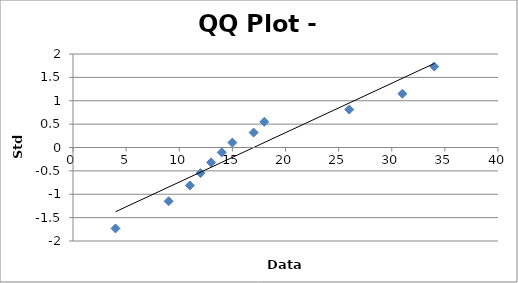
| Category | Series 0 |
|---|---|
| 4.0 | -1.732 |
| 9.0 | -1.15 |
| 11.0 | -0.812 |
| 12.0 | -0.549 |
| 13.0 | -0.319 |
| 14.0 | -0.105 |
| 15.0 | 0.105 |
| 17.0 | 0.319 |
| 18.0 | 0.549 |
| 26.0 | 0.812 |
| 31.0 | 1.15 |
| 34.0 | 1.732 |